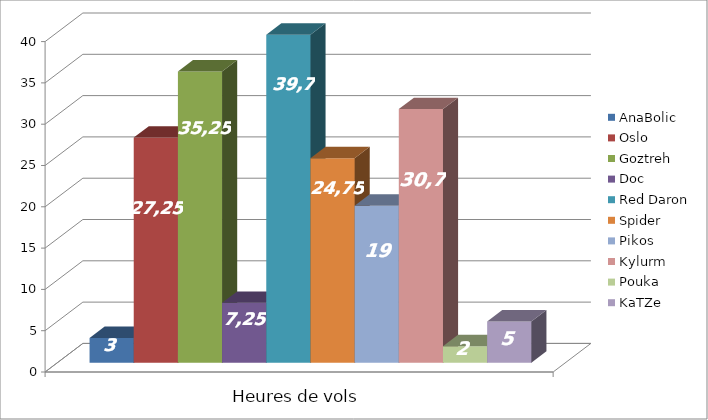
| Category | AnaBolic | Oslo | Goztreh | Doc | Red Daron | Spider | Pikos | Kylurm | Pouka | KaTZe |
|---|---|---|---|---|---|---|---|---|---|---|
| 0 | 3 | 27.25 | 35.25 | 7.25 | 39.7 | 24.75 | 19 | 30.7 | 2 | 5 |